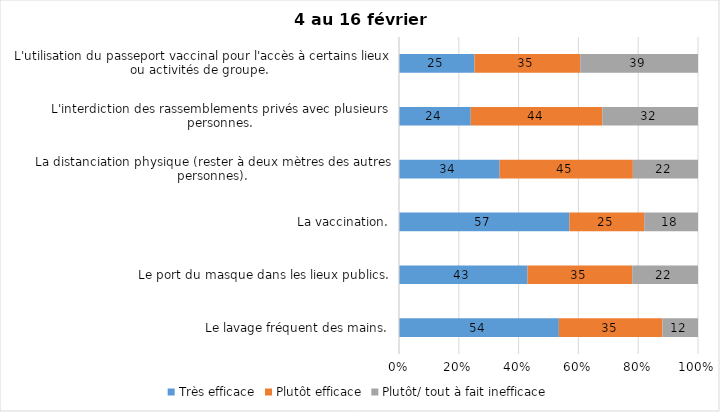
| Category | Très efficace | Plutôt efficace | Plutôt/ tout à fait inefficace |
|---|---|---|---|
| Le lavage fréquent des mains. | 54 | 35 | 12 |
| Le port du masque dans les lieux publics. | 43 | 35 | 22 |
| La vaccination. | 57 | 25 | 18 |
| La distanciation physique (rester à deux mètres des autres personnes). | 34 | 45 | 22 |
| L'interdiction des rassemblements privés avec plusieurs personnes. | 24 | 44 | 32 |
| L'utilisation du passeport vaccinal pour l'accès à certains lieux ou activités de groupe.  | 25 | 35 | 39 |